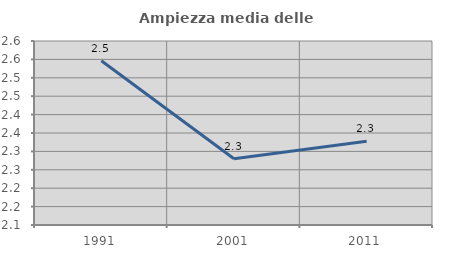
| Category | Ampiezza media delle famiglie |
|---|---|
| 1991.0 | 2.546 |
| 2001.0 | 2.28 |
| 2011.0 | 2.328 |